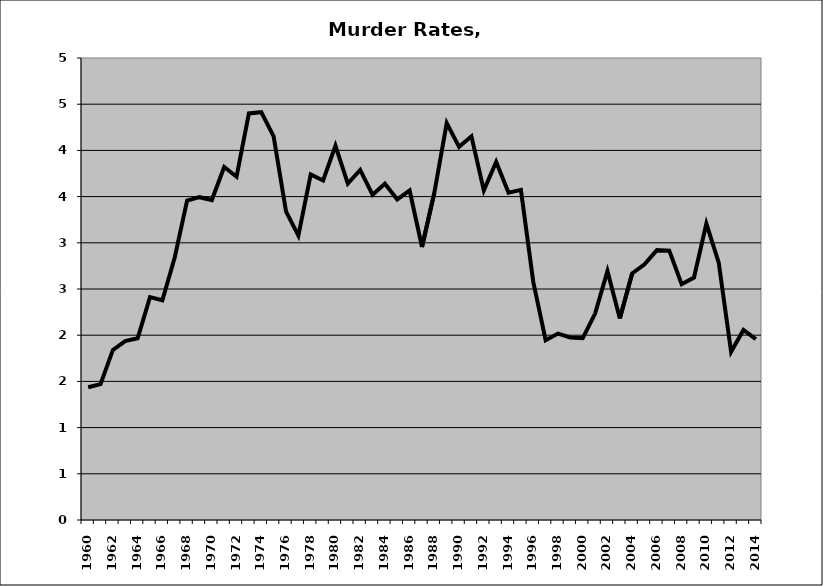
| Category | Murder |
|---|---|
| 1960.0 | 1.437 |
| 1961.0 | 1.471 |
| 1962.0 | 1.841 |
| 1963.0 | 1.936 |
| 1964.0 | 1.967 |
| 1965.0 | 2.412 |
| 1966.0 | 2.378 |
| 1967.0 | 2.841 |
| 1968.0 | 3.458 |
| 1969.0 | 3.494 |
| 1970.0 | 3.463 |
| 1971.0 | 3.821 |
| 1972.0 | 3.715 |
| 1973.0 | 4.4 |
| 1974.0 | 4.414 |
| 1975.0 | 4.152 |
| 1976.0 | 3.34 |
| 1977.0 | 3.079 |
| 1978.0 | 3.741 |
| 1979.0 | 3.675 |
| 1980.0 | 4.05 |
| 1981.0 | 3.64 |
| 1982.0 | 3.788 |
| 1983.0 | 3.52 |
| 1984.0 | 3.639 |
| 1985.0 | 3.47 |
| 1986.0 | 3.567 |
| 1987.0 | 2.955 |
| 1988.0 | 3.543 |
| 1989.0 | 4.296 |
| 1990.0 | 4.039 |
| 1991.0 | 4.153 |
| 1992.0 | 3.568 |
| 1993.0 | 3.876 |
| 1994.0 | 3.542 |
| 1995.0 | 3.573 |
| 1996.0 | 2.577 |
| 1997.0 | 1.945 |
| 1998.0 | 2.017 |
| 1999.0 | 1.976 |
| 2000.0 | 1.969 |
| 2001.0 | 2.234 |
| 2002.0 | 2.694 |
| 2003.0 | 2.181 |
| 2004.0 | 2.669 |
| 2005.0 | 2.767 |
| 2006.0 | 2.921 |
| 2007.0 | 2.915 |
| 2008.0 | 2.552 |
| 2009.0 | 2.624 |
| 2010.0 | 3.207 |
| 2011.0 | 2.785 |
| 2012.0 | 1.821 |
| 2013.0 | 2.057 |
| 2014.0 | 1.957 |